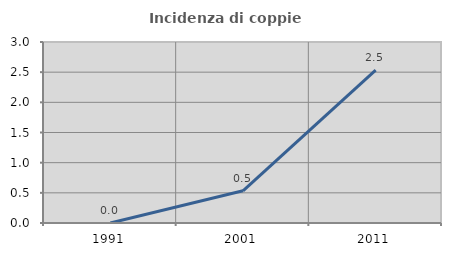
| Category | Incidenza di coppie miste |
|---|---|
| 1991.0 | 0 |
| 2001.0 | 0.533 |
| 2011.0 | 2.535 |